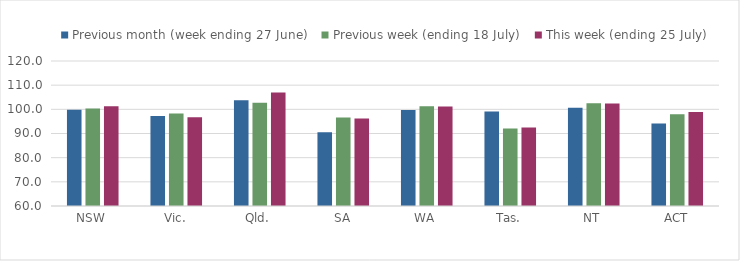
| Category | Previous month (week ending 27 June) | Previous week (ending 18 July) | This week (ending 25 July) |
|---|---|---|---|
| NSW | 99.846 | 100.296 | 101.239 |
| Vic. | 97.266 | 98.288 | 96.764 |
| Qld. | 103.773 | 102.735 | 106.948 |
| SA | 90.495 | 96.662 | 96.254 |
| WA | 99.678 | 101.278 | 101.134 |
| Tas. | 99.149 | 92.035 | 92.469 |
| NT | 100.659 | 102.538 | 102.406 |
| ACT | 94.11 | 97.995 | 98.895 |